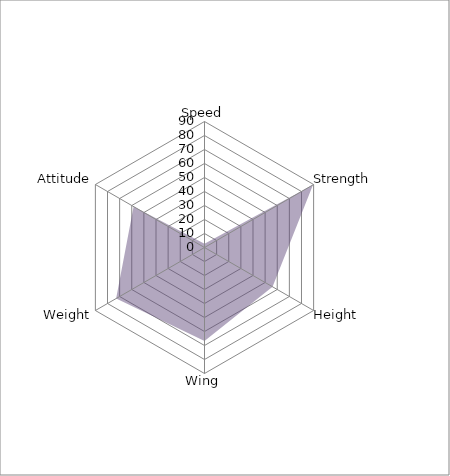
| Category | P1 |
|---|---|
| Speed | 2.726 |
| Strength | 89.513 |
| Height | 56.145 |
| Wing | 66.777 |
| Weight | 72.876 |
| Attitude | 58.461 |